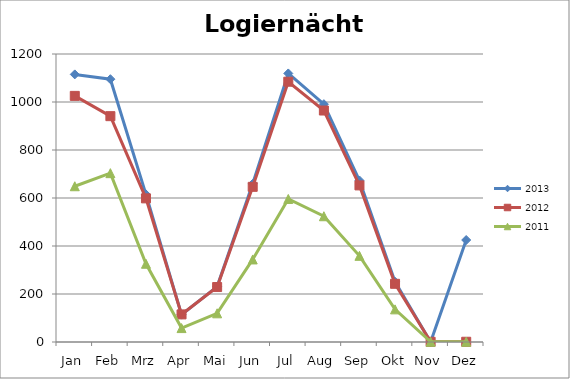
| Category | 2013 | 2012 | 2011 |
|---|---|---|---|
| Jan | 1115 | 1025.5 | 649 |
| Feb | 1095 | 941 | 703.5 |
| Mrz | 615 | 598.5 | 326 |
| Apr | 114 | 115 | 58 |
| Mai | 231 | 229 | 119.5 |
| Jun | 659 | 646.5 | 344 |
| Jul | 1119 | 1084.5 | 596 |
| Aug | 991 | 964.5 | 524 |
| Sep | 673 | 652.5 | 359 |
| Okt | 251 | 242.5 | 136 |
| Nov | 0 | 1 | 1 |
| Dez | 425 | 1 | 1 |